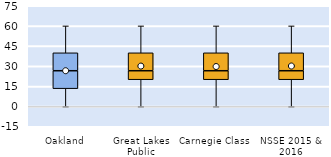
| Category | 25th | 50th | 75th |
|---|---|---|---|
| Oakland | 13.333 | 13.333 | 13.333 |
| Great Lakes Public | 20 | 6.667 | 13.333 |
| Carnegie Class | 20 | 6.667 | 13.333 |
| NSSE 2015 & 2016 | 20 | 6.667 | 13.333 |